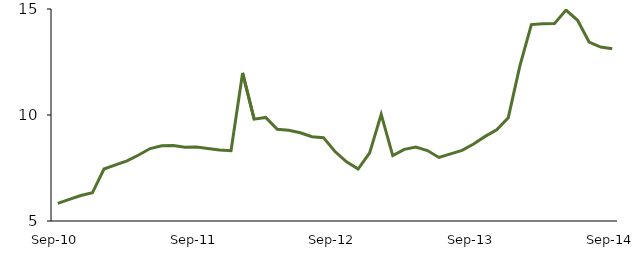
| Category | Series 0 |
|---|---|
| Sep-10 | 5.832 |
|  | 6.02 |
|  | 6.2 |
|  | 6.329 |
|  | 7.453 |
|  | 7.648 |
|  | 7.837 |
|  | 8.113 |
|  | 8.418 |
|  | 8.55 |
|  | 8.56 |
|  | 8.474 |
| Sep-11 | 8.496 |
|  | 8.419 |
|  | 8.351 |
|  | 8.318 |
|  | 11.984 |
|  | 9.805 |
|  | 9.885 |
|  | 9.324 |
|  | 9.282 |
|  | 9.163 |
|  | 8.978 |
|  | 8.932 |
| Sep-12 | 8.279 |
|  | 7.791 |
|  | 7.451 |
|  | 8.216 |
|  | 10.033 |
|  | 8.087 |
|  | 8.381 |
|  | 8.486 |
|  | 8.325 |
|  | 7.996 |
|  | 8.165 |
|  | 8.334 |
| Sep-13 | 8.631 |
|  | 8.992 |
|  | 9.299 |
|  | 9.875 |
|  | 12.304 |
|  | 14.264 |
|  | 14.305 |
|  | 14.31 |
|  | 14.951 |
|  | 14.468 |
|  | 13.441 |
|  | 13.207 |
| Sep-14 | 13.12 |